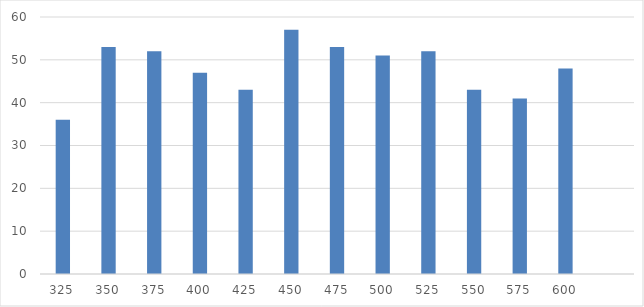
| Category | Series 0 |
|---|---|
| 325.0 | 36 |
| 350.0 | 53 |
| 375.0 | 52 |
| 400.0 | 47 |
| 425.0 | 43 |
| 450.0 | 57 |
| 475.0 | 53 |
| 500.0 | 51 |
| 525.0 | 52 |
| 550.0 | 43 |
| 575.0 | 41 |
| 600.0 | 48 |